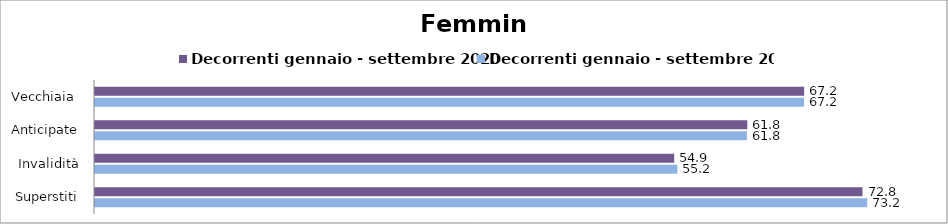
| Category | Decorrenti gennaio - settembre 2020 | Decorrenti gennaio - settembre 2021 |
|---|---|---|
| Vecchiaia  | 67.22 | 67.21 |
| Anticipate | 61.83 | 61.79 |
| Invalidità | 54.9 | 55.2 |
| Superstiti | 72.75 | 73.2 |